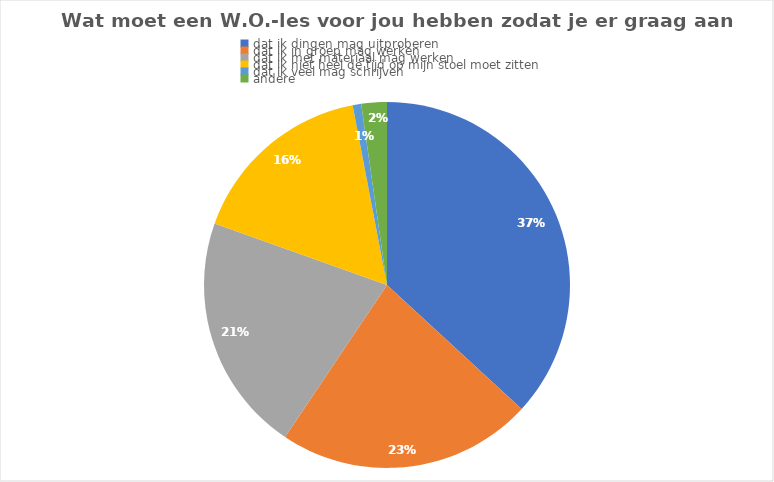
| Category | Series 0 |
|---|---|
| dat ik dingen mag uitproberen | 49 |
| dat ik in groep mag werken | 30 |
| dat ik met materiaal mag werken | 28 |
| dat ik niet heel de tijd op mijn stoel moet zitten | 22 |
| dat ik veel mag schrijven | 1 |
| andere | 3 |